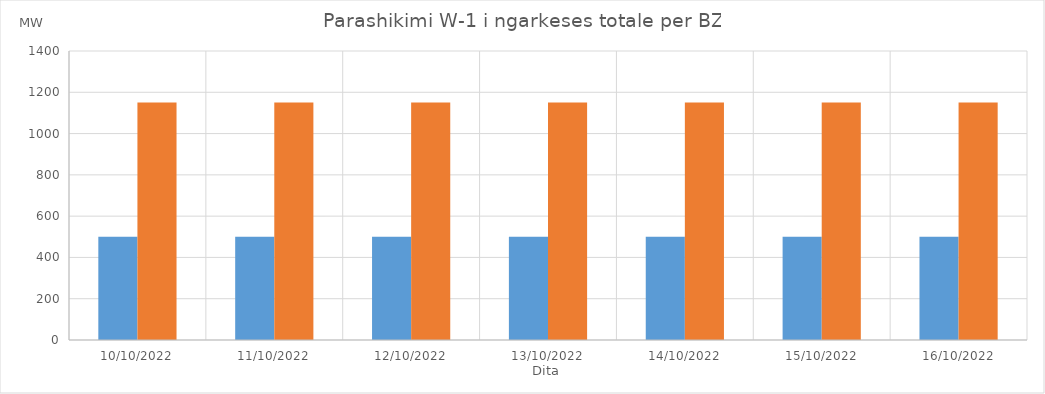
| Category | Min (MW) | Max (MW) |
|---|---|---|
| 10/10/2022 | 500 | 1150 |
| 11/10/2022 | 500 | 1150 |
| 12/10/2022 | 500 | 1150 |
| 13/10/2022 | 500 | 1150 |
| 14/10/2022 | 500 | 1150 |
| 15/10/2022 | 500 | 1150 |
| 16/10/2022 | 500 | 1150 |